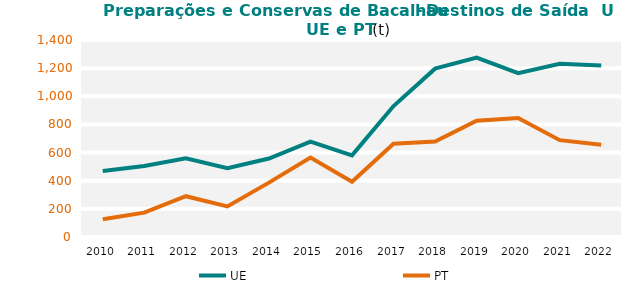
| Category | UE | PT |
|---|---|---|
| 2010.0 | 469.542 | 125.578 |
| 2011.0 | 504.595 | 173.03 |
| 2012.0 | 559.969 | 289.963 |
| 2013.0 | 489.082 | 217.468 |
| 2014.0 | 557.992 | 386.288 |
| 2015.0 | 678.417 | 564.323 |
| 2016.0 | 580.52 | 392.552 |
| 2017.0 | 930.762 | 663.138 |
| 2018.0 | 1196.187 | 678.431 |
| 2019.0 | 1274.445 | 826.901 |
| 2020.0 | 1164.628 | 845.02 |
| 2021.0 | 1231.558 | 688.171 |
| 2022.0 | 1217.931 | 655.787 |